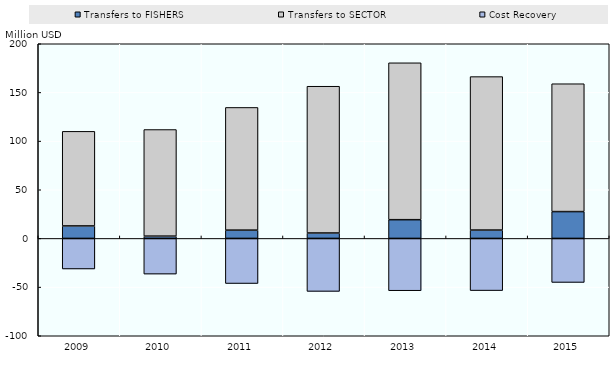
| Category | Transfers to FISHERS | Transfers to SECTOR | Cost Recovery |
|---|---|---|---|
| 2009.0 | 12.835 | 97.183 | -31.394 |
| 2010.0 | 2.354 | 109.523 | -36.657 |
| 2011.0 | 8.527 | 126.044 | -46.347 |
| 2012.0 | 5.579 | 150.788 | -54.451 |
| 2013.0 | 19.252 | 161.185 | -53.726 |
| 2014.0 | 8.585 | 157.686 | -53.604 |
| 2015.0 | 27.563 | 131.36 | -45.242 |